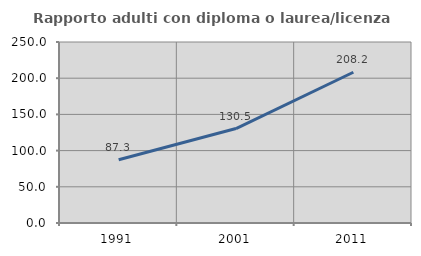
| Category | Rapporto adulti con diploma o laurea/licenza media  |
|---|---|
| 1991.0 | 87.292 |
| 2001.0 | 130.451 |
| 2011.0 | 208.206 |